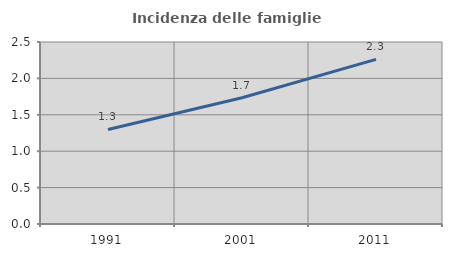
| Category | Incidenza delle famiglie numerose |
|---|---|
| 1991.0 | 1.299 |
| 2001.0 | 1.734 |
| 2011.0 | 2.261 |